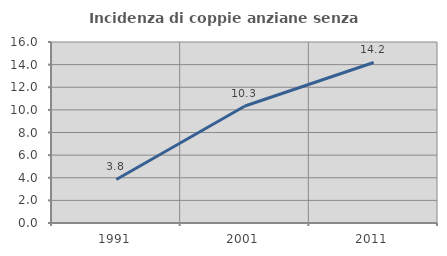
| Category | Incidenza di coppie anziane senza figli  |
|---|---|
| 1991.0 | 3.846 |
| 2001.0 | 10.345 |
| 2011.0 | 14.189 |